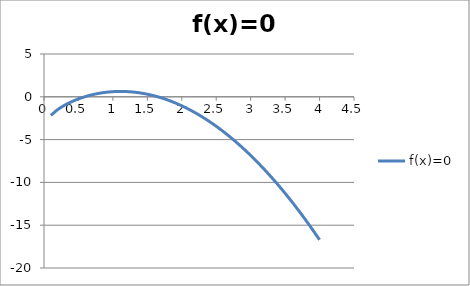
| Category | f(x)=0 |
|---|---|
| 0.1 | -2.171 |
| 0.2 | -1.485 |
| 0.30000000000000004 | -0.982 |
| 0.4 | -0.578 |
| 0.5 | -0.247 |
| 0.6 | 0.025 |
| 0.7 | 0.242 |
| 0.7999999999999999 | 0.408 |
| 0.8999999999999999 | 0.527 |
| 0.9999999999999999 | 0.6 |
| 1.0999999999999999 | 0.628 |
| 1.2 | 0.611 |
| 1.3 | 0.551 |
| 1.4000000000000001 | 0.448 |
| 1.5000000000000002 | 0.303 |
| 1.6000000000000003 | 0.115 |
| 1.7000000000000004 | -0.115 |
| 1.8000000000000005 | -0.386 |
| 1.9000000000000006 | -0.699 |
| 2.0000000000000004 | -1.053 |
| 2.1000000000000005 | -1.449 |
| 2.2000000000000006 | -1.886 |
| 2.3000000000000007 | -2.364 |
| 2.400000000000001 | -2.882 |
| 2.500000000000001 | -3.442 |
| 2.600000000000001 | -4.042 |
| 2.700000000000001 | -4.683 |
| 2.800000000000001 | -5.365 |
| 2.9000000000000012 | -6.088 |
| 3.0000000000000013 | -6.851 |
| 3.1000000000000014 | -7.654 |
| 3.2000000000000015 | -8.498 |
| 3.3000000000000016 | -9.383 |
| 3.4000000000000017 | -10.308 |
| 3.5000000000000018 | -11.274 |
| 3.600000000000002 | -12.28 |
| 3.700000000000002 | -13.326 |
| 3.800000000000002 | -14.412 |
| 3.900000000000002 | -15.54 |
| 4.000000000000002 | -16.707 |